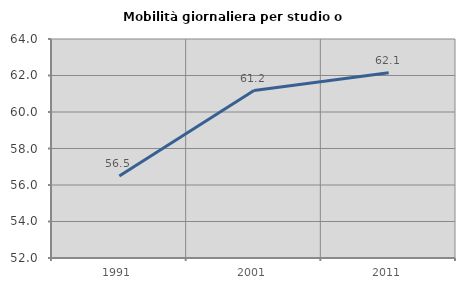
| Category | Mobilità giornaliera per studio o lavoro |
|---|---|
| 1991.0 | 56.497 |
| 2001.0 | 61.176 |
| 2011.0 | 62.147 |